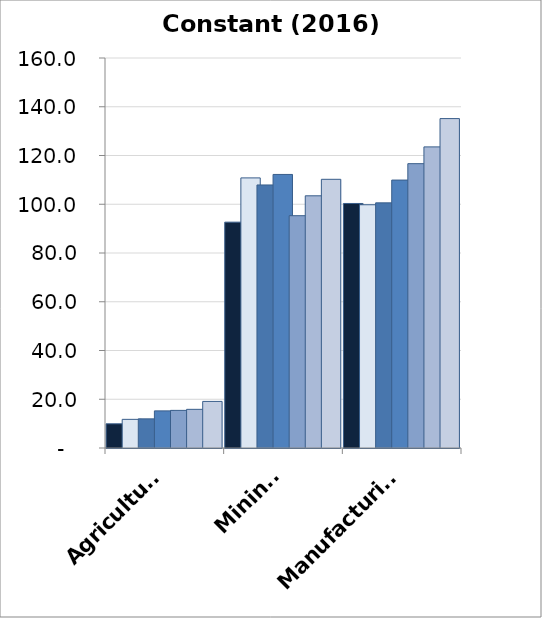
| Category | 2010 | 2011 | 2012 | 2013 | 2014 | 2015 | 2016 |
|---|---|---|---|---|---|---|---|
| Agriculture | 9.924 | 11.756 | 11.957 | 15.227 | 15.433 | 15.862 | 19.115 |
| Mining | 92.656 | 110.811 | 107.911 | 112.23 | 95.306 | 103.465 | 110.234 |
| Manufacturing | 100.318 | 99.799 | 100.565 | 109.919 | 116.65 | 123.534 | 135.141 |